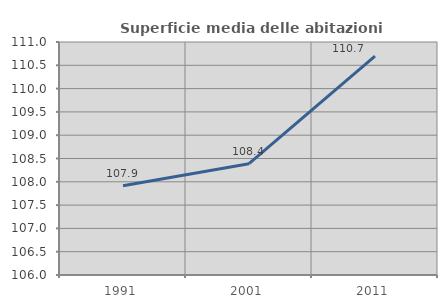
| Category | Superficie media delle abitazioni occupate |
|---|---|
| 1991.0 | 107.915 |
| 2001.0 | 108.388 |
| 2011.0 | 110.697 |